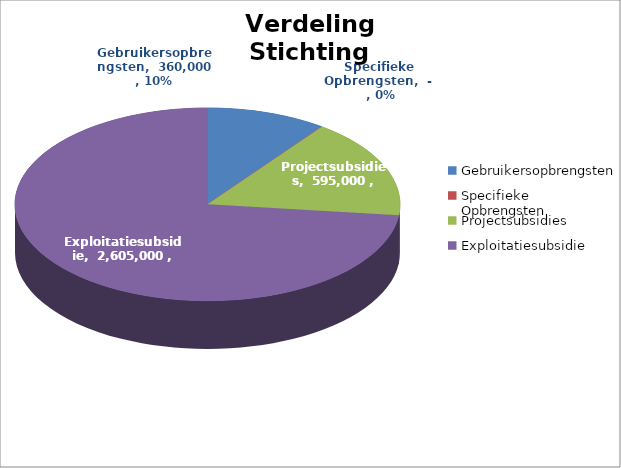
| Category | Totaal Stichting |
|---|---|
| Gebruikersopbrengsten | 360000 |
| Specifieke Opbrengsten | 0 |
| Projectsubsidies | 595000 |
| Exploitatiesubsidie | 2605000 |